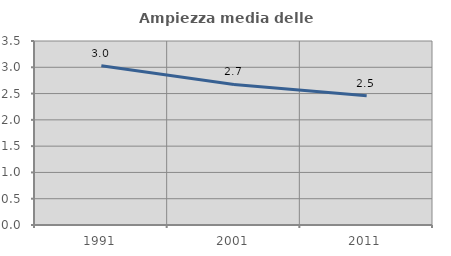
| Category | Ampiezza media delle famiglie |
|---|---|
| 1991.0 | 3.028 |
| 2001.0 | 2.675 |
| 2011.0 | 2.458 |